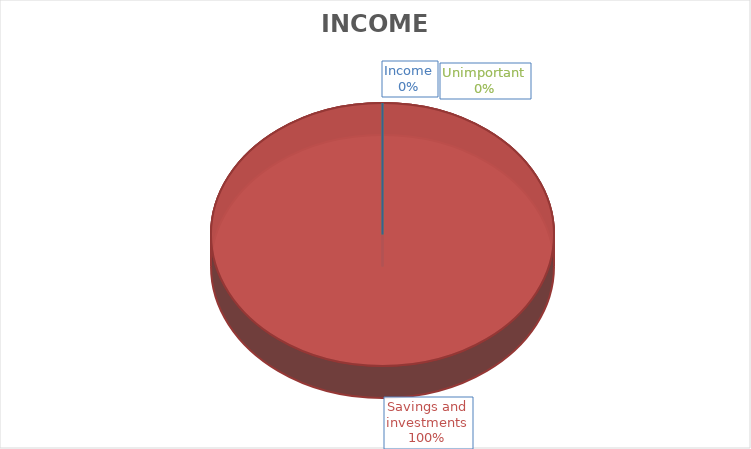
| Category | Series 0 |
|---|---|
| Income | 0 |
| Savings and investments | 15025.23 |
| Unimportant | 0 |